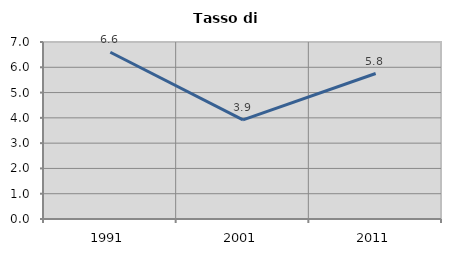
| Category | Tasso di disoccupazione   |
|---|---|
| 1991.0 | 6.593 |
| 2001.0 | 3.919 |
| 2011.0 | 5.753 |